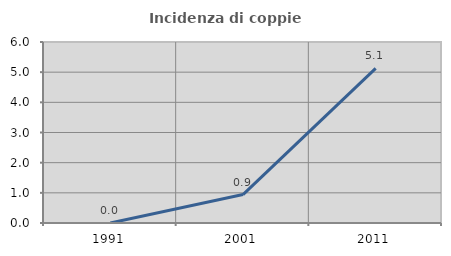
| Category | Incidenza di coppie miste |
|---|---|
| 1991.0 | 0 |
| 2001.0 | 0.943 |
| 2011.0 | 5.128 |